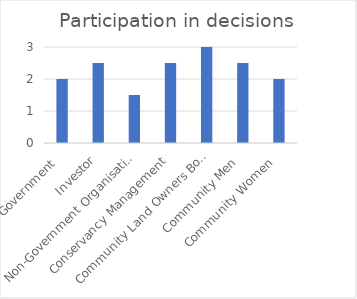
| Category | Participation in decisions |
|---|---|
| Government  | 2 |
| Investor | 2.5 |
| Non-Government Organisations | 1.5 |
| Conservancy Management | 2.5 |
| Community Land Owners Board | 3 |
| Community Men  | 2.5 |
| Community Women  | 2 |